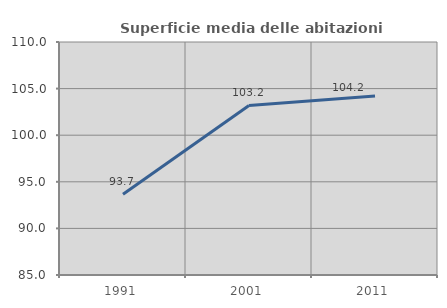
| Category | Superficie media delle abitazioni occupate |
|---|---|
| 1991.0 | 93.666 |
| 2001.0 | 103.188 |
| 2011.0 | 104.206 |